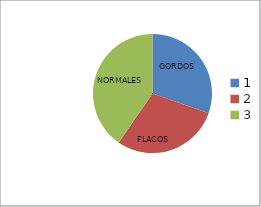
| Category | Series 0 |
|---|---|
| 0 | 79 |
| 1 | 76 |
| 2 | 105 |